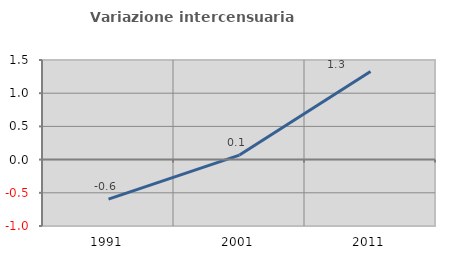
| Category | Variazione intercensuaria annua |
|---|---|
| 1991.0 | -0.595 |
| 2001.0 | 0.068 |
| 2011.0 | 1.327 |